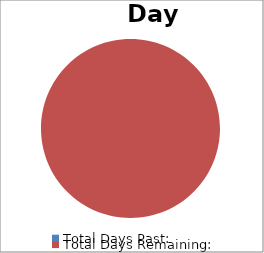
| Category | Series 0 |
|---|---|
| Total Days Past: | 0 |
| Total Days Remaining: | 92 |